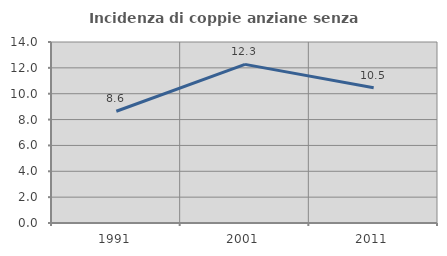
| Category | Incidenza di coppie anziane senza figli  |
|---|---|
| 1991.0 | 8.645 |
| 2001.0 | 12.271 |
| 2011.0 | 10.465 |